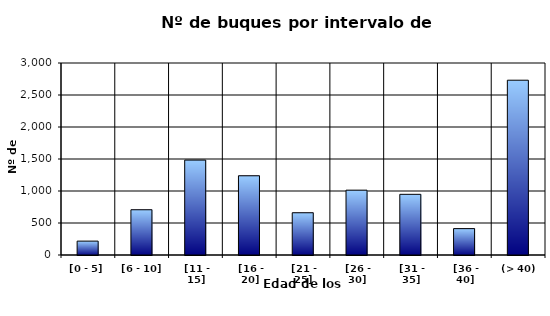
| Category | [0 - 5] |
|---|---|
| [0 - 5] | 217 |
|  [6 - 10] | 707 |
|  [11 - 15] | 1483 |
|  [16 - 20] | 1238 |
|  [21 - 25] | 660 |
|  [26 - 30] | 1013 |
|  [31 - 35] | 948 |
|  [36 - 40] | 412 |
|  (> 40) | 2731 |